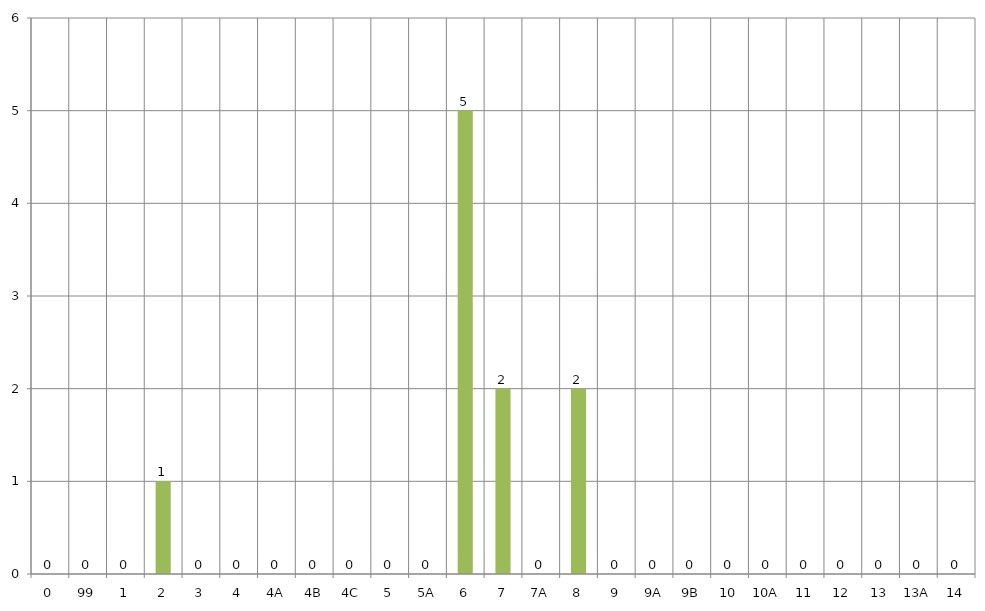
| Category | Totals |
|---|---|
| 0 | 0 |
| 99 | 0 |
| 1 | 0 |
| 2 | 1 |
| 3 | 0 |
| 4 | 0 |
| 4A | 0 |
| 4B | 0 |
| 4C | 0 |
| 5 | 0 |
| 5A | 0 |
| 6 | 5 |
| 7 | 2 |
| 7A | 0 |
| 8 | 2 |
| 9 | 0 |
| 9A | 0 |
| 9B | 0 |
| 10 | 0 |
| 10A | 0 |
| 11 | 0 |
| 12 | 0 |
| 13 | 0 |
| 13A | 0 |
| 14 | 0 |